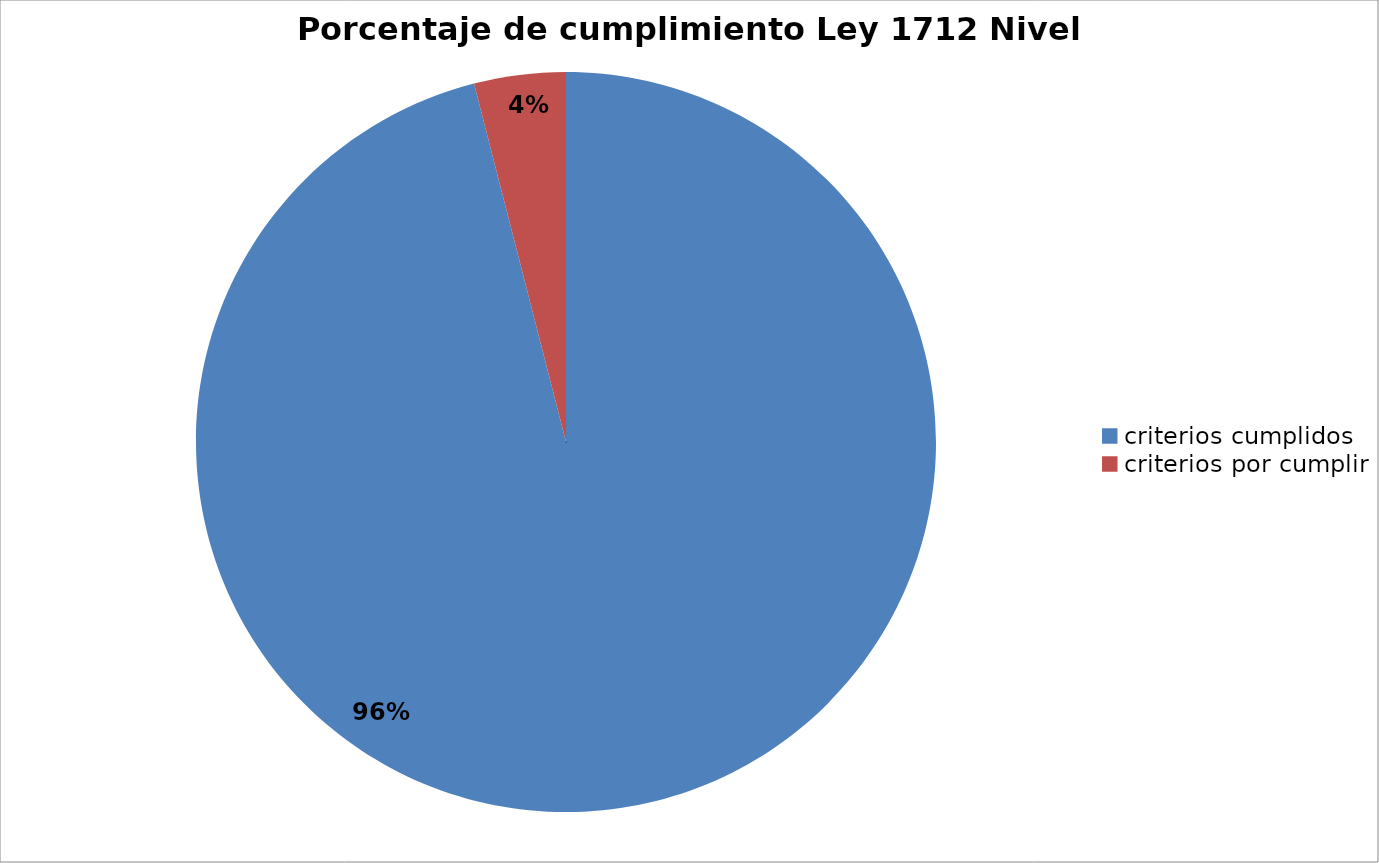
| Category | Series 0 |
|---|---|
| criterios cumplidos | 144 |
| criterios por cumplir | 6 |